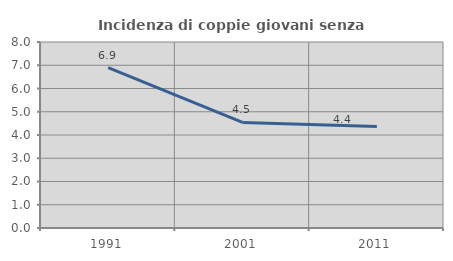
| Category | Incidenza di coppie giovani senza figli |
|---|---|
| 1991.0 | 6.897 |
| 2001.0 | 4.54 |
| 2011.0 | 4.371 |